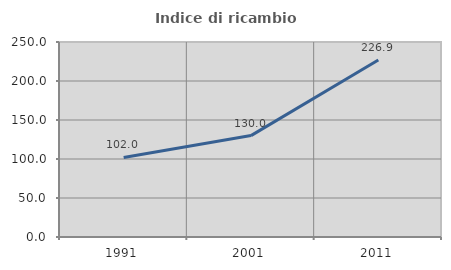
| Category | Indice di ricambio occupazionale  |
|---|---|
| 1991.0 | 101.98 |
| 2001.0 | 130 |
| 2011.0 | 226.852 |